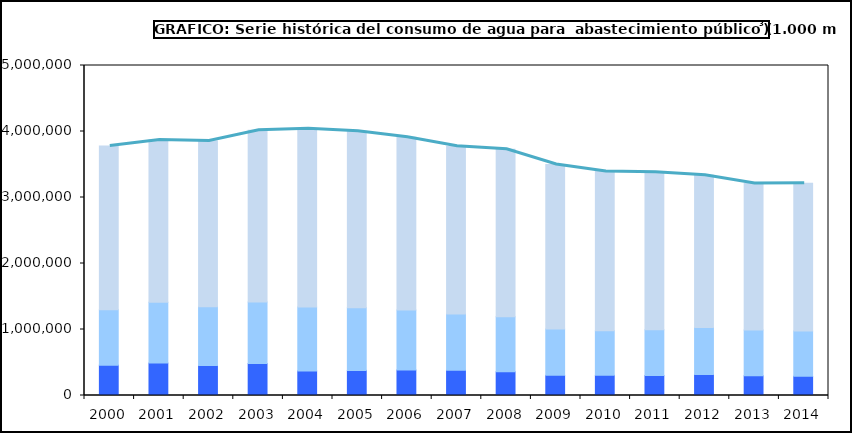
| Category | Consumos municipales | Sectores económicos  | Hogares  |
|---|---|---|---|
| 2000.0 | 459430 | 840165 | 2482085 |
| 2001.0 | 490975 | 920127 | 2459548 |
| 2002.0 | 452848 | 891039 | 2511810 |
| 2003.0 | 483402 | 933309 | 2602904 |
| 2004.0 | 372131 | 969340 | 2700928 |
| 2005.0 | 380661 | 947955 | 2673564 |
| 2006.0 | 386044 | 911264 | 2615751 |
| 2007.0 | 382046 | 852276 | 2543714 |
| 2008.0 | 358807 | 832701 | 2539891 |
| 2009.0 | 305081 | 701655 | 2493842 |
| 2010.0 | 305109 | 675454 | 2412708 |
| 2011.0 | 303512 | 693420 | 2384386 |
| 2012.0 | 317986 | 711170 | 2308872 |
| 2013.0 | 298498 | 694659 | 2217686 |
| 2014.0 | 291447 | 684841 | 2237746 |